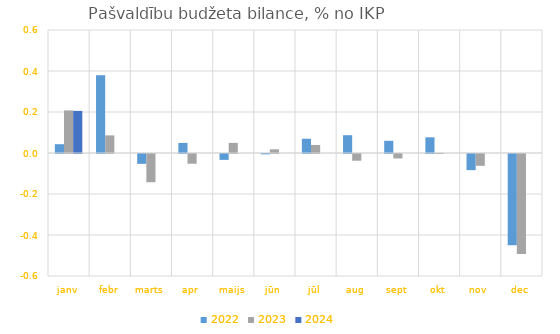
| Category | 2022 | 2023 | 2024 |
|---|---|---|---|
| janv | 0.043 | 0.208 | 0.205 |
| febr | 0.379 | 0.086 | 0 |
| marts | -0.048 | -0.138 | 0 |
| apr | 0.049 | -0.047 | 0 |
| maijs | -0.029 | 0.049 | 0 |
| jūn | -0.002 | 0.018 | 0 |
| jūl | 0.069 | 0.039 | 0 |
| aug | 0.087 | -0.033 | 0 |
| sept | 0.059 | -0.022 | 0 |
| okt | 0.077 | 0 | 0 |
| nov | -0.079 | -0.058 | 0 |
| dec | -0.445 | -0.487 | 0 |